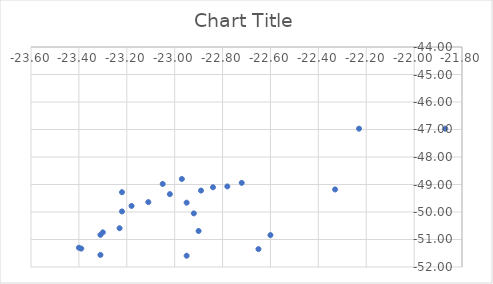
| Category | Series 0 |
|---|---|
| -22.78 | -49.07 |
| -22.6 | -50.84 |
| -22.65 | -51.35 |
| -22.92 | -50.05 |
| -22.9 | -50.69 |
| -22.84 | -49.1 |
| -22.97 | -48.8 |
| -22.33 | -49.18 |
| -22.23 | -46.97 |
| -21.87 | -46.97 |
| -22.95 | -49.66 |
| -22.72 | -48.94 |
| -22.95 | -51.59 |
| -23.22 | -49.98 |
| -23.22 | -49.28 |
| -23.31 | -50.83 |
| -23.05 | -48.98 |
| -23.02 | -49.35 |
| -23.31 | -51.56 |
| -23.18 | -49.78 |
| -22.89 | -49.22 |
| -23.11 | -49.64 |
| -23.23 | -50.59 |
| -23.3 | -50.74 |
| -23.4 | -51.3 |
| -23.39 | -51.33 |